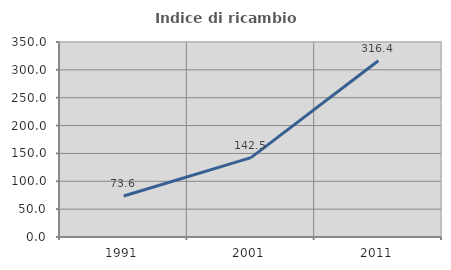
| Category | Indice di ricambio occupazionale  |
|---|---|
| 1991.0 | 73.593 |
| 2001.0 | 142.541 |
| 2011.0 | 316.393 |